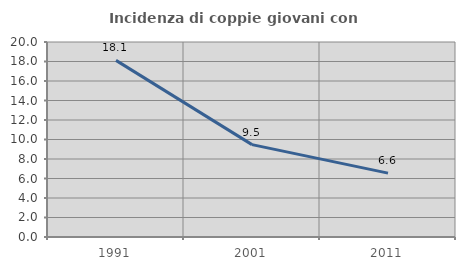
| Category | Incidenza di coppie giovani con figli |
|---|---|
| 1991.0 | 18.114 |
| 2001.0 | 9.477 |
| 2011.0 | 6.55 |